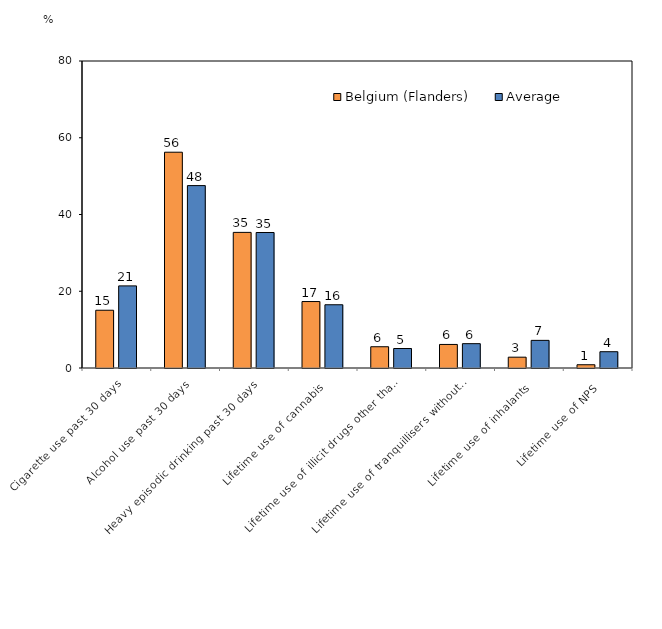
| Category | Belgium (Flanders) | Average |
|---|---|---|
| Cigarette use past 30 days | 15.05 | 21.397 |
| Alcohol use past 30 days | 56.23 | 47.531 |
| Heavy episodic drinking past 30 days | 35.34 | 35.309 |
| Lifetime use of cannabis | 17.32 | 16.48 |
| Lifetime use of illicit drugs other than cannabis | 5.54 | 5.079 |
| Lifetime use of tranquillisers without prescription  | 6.14 | 6.34 |
| Lifetime use of inhalants | 2.82 | 7.202 |
| Lifetime use of NPS | 0.85 | 4.246 |